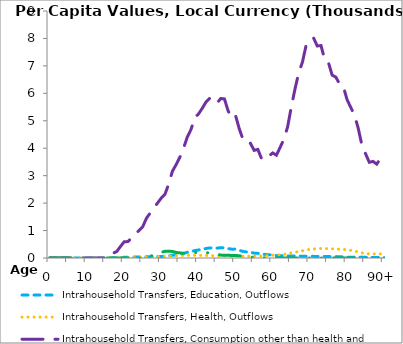
| Category | Intrahousehold Transfers, Education, Outflows | Intrahousehold Transfers, Health, Outflows | Intrahousehold Transfers, Consumption other than health and education, Outflows | Intrahousehold Transfers, Saving, Outflows |
|---|---|---|---|---|
| 0 | 0 | 0 | 0 | 0 |
|  | 0 | 0 | 0 | 0 |
| 2 | 0 | 0 | 0 | 0 |
| 3 | 0 | 0 | 0 | 0 |
| 4 | 0 | 0 | 0 | 0 |
| 5 | 0 | 0 | 0 | 0 |
| 6 | 0 | 0 | 0 | 0 |
| 7 | 0 | 0 | 0 | 0 |
| 8 | 0 | 0 | 0 | 0 |
| 9 | 0 | 0 | 0 | 0 |
| 10 | 0 | 0 | 0 | 0 |
| 11 | 0 | 0 | 0 | 0 |
| 12 | 0 | 0 | 0 | 0 |
| 13 | 0 | 0 | 0 | 0 |
| 14 | 0 | 0 | 0 | 0 |
| 15 | 0 | 0 | 0 | 0 |
| 16 | 0 | 0 | 110.151 | 0 |
| 17 | 6.632 | 3.522 | 172.98 | 0 |
| 18 | 12.105 | 5.898 | 235.81 | 0 |
| 19 | 17.579 | 8.275 | 417.817 | 0 |
| 20 | 24.406 | 11.699 | 589.994 | 0 |
| 21 | 25.258 | 10.739 | 599.037 | 0 |
| 22 | 29.962 | 12.957 | 727.139 | 0 |
| 23 | 34.601 | 16.543 | 882.132 | 0 |
| 24 | 35.371 | 20.167 | 1002.33 | 0 |
| 25 | 36.759 | 24.25 | 1139.724 | 0 |
| 26 | 42.027 | 33.341 | 1445.966 | 18.592 |
| 27 | 43.998 | 40.421 | 1639.802 | 65.203 |
| 28 | 49.469 | 46.275 | 1826.784 | 105.061 |
| 29 | 53.772 | 51.734 | 2005.236 | 172.728 |
| 30 | 56.508 | 57.802 | 2185.926 | 206.089 |
| 31 | 64.143 | 61.435 | 2324.397 | 245.348 |
| 32 | 78.224 | 70.529 | 2700.702 | 247.547 |
| 33 | 98.923 | 82.043 | 3162.086 | 238.194 |
| 34 | 118.715 | 85.128 | 3405.321 | 202.371 |
| 35 | 142.765 | 87.954 | 3670.985 | 187.44 |
| 36 | 167.961 | 92.35 | 4008.699 | 169.867 |
| 37 | 207.026 | 95.57 | 4403.907 | 182.074 |
| 38 | 233.833 | 95.785 | 4682.737 | 194.098 |
| 39 | 270.209 | 99.224 | 5112.053 | 199.118 |
| 40 | 292.192 | 95.821 | 5247.268 | 206.546 |
| 41 | 316.543 | 93.947 | 5446.386 | 217.16 |
| 42 | 344.412 | 91.485 | 5675.319 | 202.684 |
| 43 | 367.531 | 86.473 | 5815.588 | 176.927 |
| 44 | 361.057 | 82.437 | 5672.109 | 160.489 |
| 45 | 359.501 | 80.013 | 5639.938 | 142.729 |
| 46 | 374.614 | 80.064 | 5810.804 | 106.304 |
| 47 | 372.777 | 79.698 | 5798.42 | 98.004 |
| 48 | 341.805 | 73.952 | 5356.64 | 101.363 |
| 49 | 322.566 | 67.891 | 5102.208 | 91.523 |
| 50 | 323.844 | 70.341 | 5189.665 | 91.133 |
| 51 | 279.458 | 66.708 | 4705.244 | 83.273 |
| 52 | 239.306 | 63.455 | 4320.769 | 60.229 |
| 53 | 220.49 | 64.139 | 4183.197 | 45.604 |
| 54 | 209.926 | 68.539 | 4180.977 | 38.519 |
| 55 | 177.41 | 70.532 | 3921.223 | 24.839 |
| 56 | 171.184 | 74.345 | 3957.059 | 20.017 |
| 57 | 142.232 | 73.608 | 3616.897 | 12.786 |
| 58 | 130.092 | 84.511 | 3742.095 | 9.185 |
| 59 | 115.639 | 91.738 | 3720.256 | 4.79 |
| 60 | 107.453 | 100.435 | 3828.208 | 2.129 |
| 61 | 89.307 | 105.981 | 3747.082 | 2.169 |
| 62 | 85.295 | 118.889 | 4032.223 | 2.015 |
| 63 | 81.577 | 132.629 | 4327.707 | 0.402 |
| 64 | 76.512 | 153.558 | 4770.543 | 0.406 |
| 65 | 76.09 | 183.191 | 5499.013 | 0.41 |
| 66 | 75.09 | 210.455 | 6159.737 | 0.405 |
| 67 | 72.919 | 235.895 | 6751.762 | 0.397 |
| 68 | 60.517 | 263.682 | 7133.567 | 0 |
| 69 | 61.544 | 297.5 | 7756.977 | 0 |
| 70 | 60.365 | 310.261 | 7844.51 | 0 |
| 71 | 59.629 | 328.676 | 8015.662 | 0 |
| 72 | 49.964 | 336.737 | 7724.995 | 0 |
| 73 | 60.977 | 346.701 | 7741.448 | 0 |
| 74 | 53.179 | 338.103 | 7227.207 | 0 |
| 75 | 52.154 | 347.942 | 7122.37 | 0 |
| 76 | 51.105 | 332.46 | 6663.914 | 0 |
| 77 | 51.49 | 330.832 | 6590.057 | 0 |
| 78 | 44.714 | 320.102 | 6337.774 | 0 |
| 79 | 42.926 | 316.191 | 6255.13 | 0 |
| 80 | 32.989 | 292.019 | 5777.905 | 0 |
| 81 | 24.511 | 277.72 | 5487.838 | 0 |
| 82 | 32.59 | 252.238 | 5212.993 | 0 |
| 83 | 28.784 | 224.575 | 4738.608 | 0 |
| 84 | 31.954 | 185.103 | 4116.456 | 0 |
| 85 | 30.539 | 165.612 | 3798.095 | 0 |
| 86 | 30.37 | 149.153 | 3488.005 | 0 |
| 87 | 19.247 | 150.54 | 3520.002 | 0 |
| 88 | 19.923 | 141.783 | 3420.506 | 0 |
| 89 | 15.877 | 148.58 | 3627.708 | 0 |
| 90+ | 11.831 | 155.376 | 3834.909 | 0 |